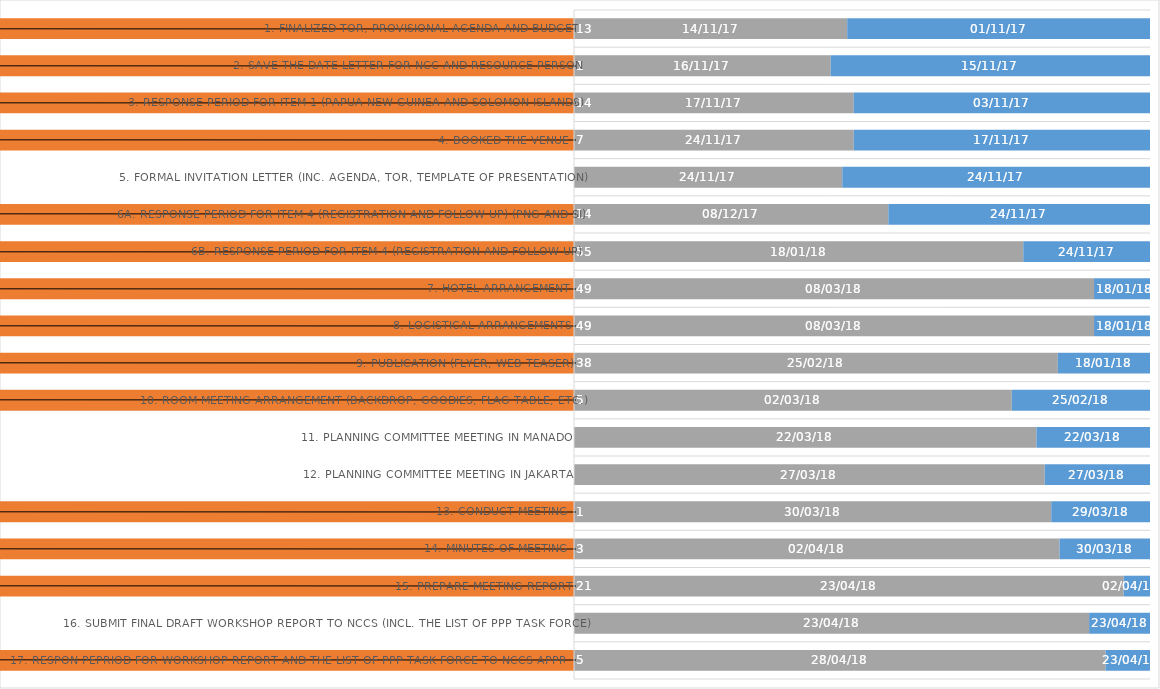
| Category | DURATION (days) | END DATE | START DATE |
|---|---|---|---|
| 1. Finalized TOR, Provisional Agenda and Budget | 13 | 2017-11-14 | 2017-11-01 |
| 2. Save the date letter for NCC and resource person | 1 | 2017-11-16 | 2017-11-15 |
| 3. Response period for item 1 (Papua New Guinea and Solomon Islands) | 14 | 2017-11-17 | 2017-11-03 |
| 4. Booked the venue | 7 | 2017-11-24 | 2017-11-17 |
| 5. Formal invitation letter (inc. Agenda, TOR, template of presentation) | 0 | 2017-11-24 | 2017-11-24 |
| 6a. Response period for item 4 (registration and follow up) (PNG and SI) | 14 | 2017-12-08 | 2017-11-24 |
| 6b. Response period for item 4 (registration and follow up) | 55 | 2018-01-18 | 2017-11-24 |
| 7. Hotel Arrangement | 49 | 2018-03-08 | 2018-01-18 |
| 8. Logistical arrangements | 49 | 2018-03-08 | 2018-01-18 |
| 9. Publication (Flyer, web teaser) | 38 | 2018-02-25 | 2018-01-18 |
| 10. Room meeting arrangement (backdrop, goodies, flag table, etc.) | 5 | 2018-03-02 | 2018-02-25 |
| 11. Planning Committee Meeting in Manado | 0 | 2018-03-22 | 2018-03-22 |
| 12. Planning Committee Meeting in Jakarta | 0 | 2018-03-27 | 2018-03-27 |
| 13. Conduct Meeting | 1 | 2018-03-30 | 2018-03-29 |
| 14. Minutes of Meeting | 3 | 2018-04-02 | 2018-03-30 |
| 15. Prepare Meeting Report | 21 | 2018-04-23 | 2018-04-02 |
| 16. Submit Final Draft Workshop Report to NCCs (incl. the list of PPP Task Force) | 0 | 2018-04-23 | 2018-04-23 |
| 17. Respon pepriod for Workshop Report and the list of PPP Task Force to NCCs approval | 5 | 2018-04-28 | 2018-04-23 |